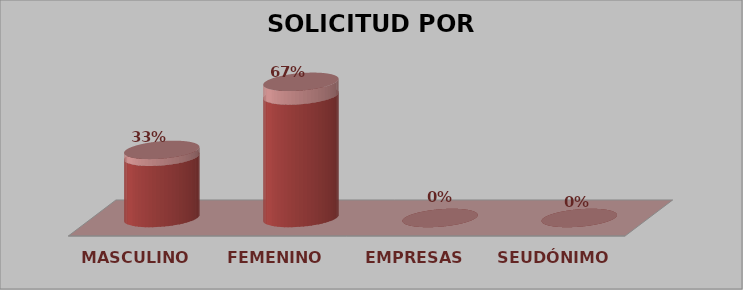
| Category | SOLICITUD POR GÉNERO | Series 1 |
|---|---|---|
| MASCULINO | 3 | 0.333 |
| FEMENINO | 6 | 0.667 |
| EMPRESAS | 0 | 0 |
| SEUDÓNIMO | 0 | 0 |